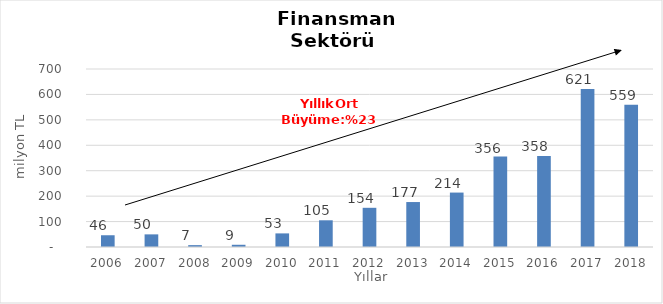
| Category | Finansman |
|---|---|
| 2006.0 | 46.209 |
| 2007.0 | 49.659 |
| 2008.0 | 7.339 |
| 2009.0 | 8.77 |
| 2010.0 | 53.492 |
| 2011.0 | 105.032 |
| 2012.0 | 154.13 |
| 2013.0 | 176.798 |
| 2014.0 | 214.053 |
| 2015.0 | 356 |
| 2016.0 | 358 |
| 2017.0 | 621 |
| 2018.0 | 559 |